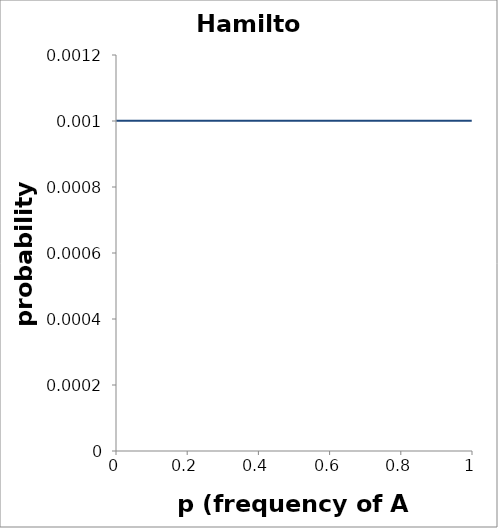
| Category | probability |
|---|---|
| 0.001 | 0.001 |
| 0.002 | 0.001 |
| 0.003 | 0.001 |
| 0.004 | 0.001 |
| 0.005 | 0.001 |
| 0.006 | 0.001 |
| 0.007 | 0.001 |
| 0.008 | 0.001 |
| 0.009 | 0.001 |
| 0.01 | 0.001 |
| 0.011 | 0.001 |
| 0.012 | 0.001 |
| 0.013 | 0.001 |
| 0.014 | 0.001 |
| 0.015 | 0.001 |
| 0.016 | 0.001 |
| 0.017 | 0.001 |
| 0.018 | 0.001 |
| 0.019 | 0.001 |
| 0.02 | 0.001 |
| 0.021 | 0.001 |
| 0.022 | 0.001 |
| 0.023 | 0.001 |
| 0.024 | 0.001 |
| 0.025 | 0.001 |
| 0.026 | 0.001 |
| 0.027 | 0.001 |
| 0.028 | 0.001 |
| 0.029 | 0.001 |
| 0.03 | 0.001 |
| 0.031 | 0.001 |
| 0.032 | 0.001 |
| 0.033 | 0.001 |
| 0.034 | 0.001 |
| 0.035 | 0.001 |
| 0.036 | 0.001 |
| 0.037 | 0.001 |
| 0.038 | 0.001 |
| 0.039 | 0.001 |
| 0.04 | 0.001 |
| 0.041 | 0.001 |
| 0.042 | 0.001 |
| 0.043 | 0.001 |
| 0.044 | 0.001 |
| 0.045 | 0.001 |
| 0.046 | 0.001 |
| 0.047 | 0.001 |
| 0.048 | 0.001 |
| 0.049 | 0.001 |
| 0.05 | 0.001 |
| 0.051 | 0.001 |
| 0.052 | 0.001 |
| 0.053 | 0.001 |
| 0.054 | 0.001 |
| 0.055 | 0.001 |
| 0.056 | 0.001 |
| 0.057 | 0.001 |
| 0.058 | 0.001 |
| 0.059 | 0.001 |
| 0.06 | 0.001 |
| 0.061 | 0.001 |
| 0.062 | 0.001 |
| 0.063 | 0.001 |
| 0.064 | 0.001 |
| 0.065 | 0.001 |
| 0.066 | 0.001 |
| 0.067 | 0.001 |
| 0.068 | 0.001 |
| 0.069 | 0.001 |
| 0.07 | 0.001 |
| 0.071 | 0.001 |
| 0.072 | 0.001 |
| 0.073 | 0.001 |
| 0.074 | 0.001 |
| 0.075 | 0.001 |
| 0.076 | 0.001 |
| 0.077 | 0.001 |
| 0.078 | 0.001 |
| 0.079 | 0.001 |
| 0.08 | 0.001 |
| 0.081 | 0.001 |
| 0.082 | 0.001 |
| 0.083 | 0.001 |
| 0.084 | 0.001 |
| 0.085 | 0.001 |
| 0.086 | 0.001 |
| 0.087 | 0.001 |
| 0.088 | 0.001 |
| 0.089 | 0.001 |
| 0.09 | 0.001 |
| 0.091 | 0.001 |
| 0.092 | 0.001 |
| 0.093 | 0.001 |
| 0.094 | 0.001 |
| 0.095 | 0.001 |
| 0.096 | 0.001 |
| 0.097 | 0.001 |
| 0.098 | 0.001 |
| 0.099 | 0.001 |
| 0.1 | 0.001 |
| 0.101 | 0.001 |
| 0.102 | 0.001 |
| 0.103 | 0.001 |
| 0.104 | 0.001 |
| 0.105 | 0.001 |
| 0.106 | 0.001 |
| 0.107 | 0.001 |
| 0.108 | 0.001 |
| 0.109 | 0.001 |
| 0.11 | 0.001 |
| 0.111 | 0.001 |
| 0.112 | 0.001 |
| 0.113 | 0.001 |
| 0.114 | 0.001 |
| 0.115 | 0.001 |
| 0.116 | 0.001 |
| 0.117 | 0.001 |
| 0.118 | 0.001 |
| 0.119 | 0.001 |
| 0.12 | 0.001 |
| 0.121 | 0.001 |
| 0.122 | 0.001 |
| 0.123 | 0.001 |
| 0.124 | 0.001 |
| 0.125 | 0.001 |
| 0.126 | 0.001 |
| 0.127 | 0.001 |
| 0.128 | 0.001 |
| 0.129 | 0.001 |
| 0.13 | 0.001 |
| 0.131 | 0.001 |
| 0.132 | 0.001 |
| 0.133 | 0.001 |
| 0.134 | 0.001 |
| 0.135 | 0.001 |
| 0.136 | 0.001 |
| 0.137 | 0.001 |
| 0.138 | 0.001 |
| 0.139 | 0.001 |
| 0.14 | 0.001 |
| 0.141 | 0.001 |
| 0.142 | 0.001 |
| 0.143 | 0.001 |
| 0.144 | 0.001 |
| 0.145 | 0.001 |
| 0.146 | 0.001 |
| 0.147 | 0.001 |
| 0.148 | 0.001 |
| 0.149 | 0.001 |
| 0.15 | 0.001 |
| 0.151 | 0.001 |
| 0.152 | 0.001 |
| 0.153 | 0.001 |
| 0.154 | 0.001 |
| 0.155 | 0.001 |
| 0.156 | 0.001 |
| 0.157 | 0.001 |
| 0.158 | 0.001 |
| 0.159 | 0.001 |
| 0.16 | 0.001 |
| 0.161 | 0.001 |
| 0.162 | 0.001 |
| 0.163 | 0.001 |
| 0.164 | 0.001 |
| 0.165 | 0.001 |
| 0.166 | 0.001 |
| 0.167 | 0.001 |
| 0.168 | 0.001 |
| 0.169 | 0.001 |
| 0.17 | 0.001 |
| 0.171 | 0.001 |
| 0.172 | 0.001 |
| 0.173 | 0.001 |
| 0.174 | 0.001 |
| 0.175 | 0.001 |
| 0.176 | 0.001 |
| 0.177 | 0.001 |
| 0.178 | 0.001 |
| 0.179 | 0.001 |
| 0.18 | 0.001 |
| 0.181 | 0.001 |
| 0.182 | 0.001 |
| 0.183 | 0.001 |
| 0.184 | 0.001 |
| 0.185 | 0.001 |
| 0.186 | 0.001 |
| 0.187 | 0.001 |
| 0.188 | 0.001 |
| 0.189 | 0.001 |
| 0.19 | 0.001 |
| 0.191 | 0.001 |
| 0.192 | 0.001 |
| 0.193 | 0.001 |
| 0.194 | 0.001 |
| 0.195 | 0.001 |
| 0.196 | 0.001 |
| 0.197 | 0.001 |
| 0.198 | 0.001 |
| 0.199 | 0.001 |
| 0.2 | 0.001 |
| 0.201 | 0.001 |
| 0.202 | 0.001 |
| 0.203 | 0.001 |
| 0.204 | 0.001 |
| 0.205 | 0.001 |
| 0.206 | 0.001 |
| 0.207 | 0.001 |
| 0.208 | 0.001 |
| 0.209 | 0.001 |
| 0.21 | 0.001 |
| 0.211 | 0.001 |
| 0.212 | 0.001 |
| 0.213 | 0.001 |
| 0.214 | 0.001 |
| 0.215 | 0.001 |
| 0.216 | 0.001 |
| 0.217 | 0.001 |
| 0.218 | 0.001 |
| 0.219 | 0.001 |
| 0.22 | 0.001 |
| 0.221 | 0.001 |
| 0.222 | 0.001 |
| 0.223 | 0.001 |
| 0.224 | 0.001 |
| 0.225 | 0.001 |
| 0.226 | 0.001 |
| 0.227 | 0.001 |
| 0.228 | 0.001 |
| 0.229 | 0.001 |
| 0.23 | 0.001 |
| 0.231 | 0.001 |
| 0.232 | 0.001 |
| 0.233 | 0.001 |
| 0.234 | 0.001 |
| 0.235 | 0.001 |
| 0.236 | 0.001 |
| 0.237 | 0.001 |
| 0.238 | 0.001 |
| 0.239 | 0.001 |
| 0.24 | 0.001 |
| 0.241 | 0.001 |
| 0.242 | 0.001 |
| 0.243 | 0.001 |
| 0.244 | 0.001 |
| 0.245 | 0.001 |
| 0.246 | 0.001 |
| 0.247 | 0.001 |
| 0.248 | 0.001 |
| 0.249 | 0.001 |
| 0.25 | 0.001 |
| 0.251 | 0.001 |
| 0.252 | 0.001 |
| 0.253 | 0.001 |
| 0.254 | 0.001 |
| 0.255 | 0.001 |
| 0.256 | 0.001 |
| 0.257 | 0.001 |
| 0.258 | 0.001 |
| 0.259 | 0.001 |
| 0.26 | 0.001 |
| 0.261 | 0.001 |
| 0.262 | 0.001 |
| 0.263 | 0.001 |
| 0.264 | 0.001 |
| 0.265 | 0.001 |
| 0.266 | 0.001 |
| 0.267 | 0.001 |
| 0.268 | 0.001 |
| 0.269 | 0.001 |
| 0.27 | 0.001 |
| 0.271 | 0.001 |
| 0.272 | 0.001 |
| 0.273 | 0.001 |
| 0.274 | 0.001 |
| 0.275 | 0.001 |
| 0.276 | 0.001 |
| 0.277 | 0.001 |
| 0.278 | 0.001 |
| 0.279 | 0.001 |
| 0.28 | 0.001 |
| 0.281 | 0.001 |
| 0.282 | 0.001 |
| 0.283 | 0.001 |
| 0.284 | 0.001 |
| 0.285 | 0.001 |
| 0.286 | 0.001 |
| 0.287 | 0.001 |
| 0.288 | 0.001 |
| 0.289 | 0.001 |
| 0.29 | 0.001 |
| 0.291 | 0.001 |
| 0.292 | 0.001 |
| 0.293 | 0.001 |
| 0.294 | 0.001 |
| 0.295 | 0.001 |
| 0.296 | 0.001 |
| 0.297 | 0.001 |
| 0.298 | 0.001 |
| 0.299 | 0.001 |
| 0.3 | 0.001 |
| 0.301 | 0.001 |
| 0.302 | 0.001 |
| 0.303 | 0.001 |
| 0.304 | 0.001 |
| 0.305 | 0.001 |
| 0.306 | 0.001 |
| 0.307 | 0.001 |
| 0.308 | 0.001 |
| 0.309 | 0.001 |
| 0.31 | 0.001 |
| 0.311 | 0.001 |
| 0.312 | 0.001 |
| 0.313 | 0.001 |
| 0.314 | 0.001 |
| 0.315 | 0.001 |
| 0.316 | 0.001 |
| 0.317 | 0.001 |
| 0.318 | 0.001 |
| 0.319 | 0.001 |
| 0.32 | 0.001 |
| 0.321 | 0.001 |
| 0.322 | 0.001 |
| 0.323 | 0.001 |
| 0.324 | 0.001 |
| 0.325 | 0.001 |
| 0.326 | 0.001 |
| 0.327 | 0.001 |
| 0.328 | 0.001 |
| 0.329 | 0.001 |
| 0.33 | 0.001 |
| 0.331 | 0.001 |
| 0.332 | 0.001 |
| 0.333 | 0.001 |
| 0.334 | 0.001 |
| 0.335 | 0.001 |
| 0.336 | 0.001 |
| 0.337 | 0.001 |
| 0.338 | 0.001 |
| 0.339 | 0.001 |
| 0.34 | 0.001 |
| 0.341 | 0.001 |
| 0.342 | 0.001 |
| 0.343 | 0.001 |
| 0.344 | 0.001 |
| 0.345 | 0.001 |
| 0.346 | 0.001 |
| 0.347 | 0.001 |
| 0.348 | 0.001 |
| 0.349 | 0.001 |
| 0.35 | 0.001 |
| 0.351 | 0.001 |
| 0.352 | 0.001 |
| 0.353 | 0.001 |
| 0.354 | 0.001 |
| 0.355 | 0.001 |
| 0.356 | 0.001 |
| 0.357 | 0.001 |
| 0.358 | 0.001 |
| 0.359 | 0.001 |
| 0.36 | 0.001 |
| 0.361 | 0.001 |
| 0.362 | 0.001 |
| 0.363 | 0.001 |
| 0.364 | 0.001 |
| 0.365 | 0.001 |
| 0.366 | 0.001 |
| 0.367 | 0.001 |
| 0.368 | 0.001 |
| 0.369 | 0.001 |
| 0.37 | 0.001 |
| 0.371 | 0.001 |
| 0.372 | 0.001 |
| 0.373 | 0.001 |
| 0.374 | 0.001 |
| 0.375 | 0.001 |
| 0.376 | 0.001 |
| 0.377 | 0.001 |
| 0.378 | 0.001 |
| 0.379 | 0.001 |
| 0.38 | 0.001 |
| 0.381 | 0.001 |
| 0.382 | 0.001 |
| 0.383 | 0.001 |
| 0.384 | 0.001 |
| 0.385 | 0.001 |
| 0.386 | 0.001 |
| 0.387 | 0.001 |
| 0.388 | 0.001 |
| 0.389 | 0.001 |
| 0.39 | 0.001 |
| 0.391 | 0.001 |
| 0.392 | 0.001 |
| 0.393 | 0.001 |
| 0.394 | 0.001 |
| 0.395 | 0.001 |
| 0.396 | 0.001 |
| 0.397 | 0.001 |
| 0.398 | 0.001 |
| 0.399 | 0.001 |
| 0.4 | 0.001 |
| 0.401 | 0.001 |
| 0.402 | 0.001 |
| 0.403 | 0.001 |
| 0.404 | 0.001 |
| 0.405 | 0.001 |
| 0.406 | 0.001 |
| 0.407 | 0.001 |
| 0.408 | 0.001 |
| 0.409 | 0.001 |
| 0.41 | 0.001 |
| 0.411 | 0.001 |
| 0.412 | 0.001 |
| 0.413 | 0.001 |
| 0.414 | 0.001 |
| 0.415 | 0.001 |
| 0.416 | 0.001 |
| 0.417 | 0.001 |
| 0.418 | 0.001 |
| 0.419 | 0.001 |
| 0.42 | 0.001 |
| 0.421 | 0.001 |
| 0.422 | 0.001 |
| 0.423 | 0.001 |
| 0.424 | 0.001 |
| 0.425 | 0.001 |
| 0.426 | 0.001 |
| 0.427 | 0.001 |
| 0.428 | 0.001 |
| 0.429 | 0.001 |
| 0.43 | 0.001 |
| 0.431 | 0.001 |
| 0.432 | 0.001 |
| 0.433 | 0.001 |
| 0.434 | 0.001 |
| 0.435 | 0.001 |
| 0.436 | 0.001 |
| 0.437 | 0.001 |
| 0.438 | 0.001 |
| 0.439 | 0.001 |
| 0.44 | 0.001 |
| 0.441 | 0.001 |
| 0.442 | 0.001 |
| 0.443 | 0.001 |
| 0.444 | 0.001 |
| 0.445 | 0.001 |
| 0.446 | 0.001 |
| 0.447 | 0.001 |
| 0.448 | 0.001 |
| 0.449 | 0.001 |
| 0.45 | 0.001 |
| 0.451 | 0.001 |
| 0.452 | 0.001 |
| 0.453 | 0.001 |
| 0.454 | 0.001 |
| 0.455 | 0.001 |
| 0.456 | 0.001 |
| 0.457 | 0.001 |
| 0.458 | 0.001 |
| 0.459 | 0.001 |
| 0.46 | 0.001 |
| 0.461 | 0.001 |
| 0.462 | 0.001 |
| 0.463 | 0.001 |
| 0.464 | 0.001 |
| 0.465 | 0.001 |
| 0.466 | 0.001 |
| 0.467 | 0.001 |
| 0.468 | 0.001 |
| 0.469 | 0.001 |
| 0.47 | 0.001 |
| 0.471 | 0.001 |
| 0.472 | 0.001 |
| 0.473 | 0.001 |
| 0.474 | 0.001 |
| 0.475 | 0.001 |
| 0.476 | 0.001 |
| 0.477 | 0.001 |
| 0.478 | 0.001 |
| 0.479 | 0.001 |
| 0.48 | 0.001 |
| 0.481 | 0.001 |
| 0.482 | 0.001 |
| 0.483 | 0.001 |
| 0.484 | 0.001 |
| 0.485 | 0.001 |
| 0.486 | 0.001 |
| 0.487 | 0.001 |
| 0.488 | 0.001 |
| 0.489 | 0.001 |
| 0.49 | 0.001 |
| 0.491 | 0.001 |
| 0.492 | 0.001 |
| 0.493 | 0.001 |
| 0.494 | 0.001 |
| 0.495 | 0.001 |
| 0.496 | 0.001 |
| 0.497 | 0.001 |
| 0.498 | 0.001 |
| 0.499 | 0.001 |
| 0.5 | 0.001 |
| 0.501 | 0.001 |
| 0.502 | 0.001 |
| 0.503 | 0.001 |
| 0.504 | 0.001 |
| 0.505 | 0.001 |
| 0.506 | 0.001 |
| 0.507 | 0.001 |
| 0.508 | 0.001 |
| 0.509 | 0.001 |
| 0.51 | 0.001 |
| 0.511 | 0.001 |
| 0.512 | 0.001 |
| 0.513 | 0.001 |
| 0.514 | 0.001 |
| 0.515 | 0.001 |
| 0.516 | 0.001 |
| 0.517 | 0.001 |
| 0.518 | 0.001 |
| 0.519 | 0.001 |
| 0.52 | 0.001 |
| 0.521 | 0.001 |
| 0.522 | 0.001 |
| 0.523 | 0.001 |
| 0.524 | 0.001 |
| 0.525 | 0.001 |
| 0.526 | 0.001 |
| 0.527 | 0.001 |
| 0.528 | 0.001 |
| 0.529 | 0.001 |
| 0.53 | 0.001 |
| 0.531 | 0.001 |
| 0.532 | 0.001 |
| 0.533 | 0.001 |
| 0.534 | 0.001 |
| 0.535 | 0.001 |
| 0.536 | 0.001 |
| 0.537 | 0.001 |
| 0.538 | 0.001 |
| 0.539 | 0.001 |
| 0.54 | 0.001 |
| 0.541 | 0.001 |
| 0.542 | 0.001 |
| 0.543 | 0.001 |
| 0.544 | 0.001 |
| 0.545 | 0.001 |
| 0.546 | 0.001 |
| 0.547 | 0.001 |
| 0.548 | 0.001 |
| 0.549 | 0.001 |
| 0.55 | 0.001 |
| 0.551 | 0.001 |
| 0.552 | 0.001 |
| 0.553 | 0.001 |
| 0.554 | 0.001 |
| 0.555 | 0.001 |
| 0.556 | 0.001 |
| 0.557 | 0.001 |
| 0.558 | 0.001 |
| 0.559 | 0.001 |
| 0.56 | 0.001 |
| 0.561 | 0.001 |
| 0.562 | 0.001 |
| 0.563 | 0.001 |
| 0.564 | 0.001 |
| 0.565 | 0.001 |
| 0.566 | 0.001 |
| 0.567 | 0.001 |
| 0.568 | 0.001 |
| 0.569 | 0.001 |
| 0.57 | 0.001 |
| 0.571 | 0.001 |
| 0.572 | 0.001 |
| 0.573 | 0.001 |
| 0.574 | 0.001 |
| 0.575 | 0.001 |
| 0.576 | 0.001 |
| 0.577 | 0.001 |
| 0.578 | 0.001 |
| 0.579 | 0.001 |
| 0.58 | 0.001 |
| 0.581 | 0.001 |
| 0.582 | 0.001 |
| 0.583 | 0.001 |
| 0.584 | 0.001 |
| 0.585 | 0.001 |
| 0.586 | 0.001 |
| 0.587 | 0.001 |
| 0.588 | 0.001 |
| 0.589 | 0.001 |
| 0.59 | 0.001 |
| 0.591 | 0.001 |
| 0.592 | 0.001 |
| 0.593 | 0.001 |
| 0.594 | 0.001 |
| 0.595 | 0.001 |
| 0.596 | 0.001 |
| 0.597 | 0.001 |
| 0.598 | 0.001 |
| 0.599 | 0.001 |
| 0.6 | 0.001 |
| 0.601 | 0.001 |
| 0.602 | 0.001 |
| 0.603 | 0.001 |
| 0.604 | 0.001 |
| 0.605 | 0.001 |
| 0.606 | 0.001 |
| 0.607 | 0.001 |
| 0.608 | 0.001 |
| 0.609 | 0.001 |
| 0.61 | 0.001 |
| 0.611 | 0.001 |
| 0.612 | 0.001 |
| 0.613 | 0.001 |
| 0.614 | 0.001 |
| 0.615 | 0.001 |
| 0.616 | 0.001 |
| 0.617 | 0.001 |
| 0.618 | 0.001 |
| 0.619 | 0.001 |
| 0.62 | 0.001 |
| 0.621 | 0.001 |
| 0.622 | 0.001 |
| 0.623 | 0.001 |
| 0.624 | 0.001 |
| 0.625 | 0.001 |
| 0.626 | 0.001 |
| 0.627 | 0.001 |
| 0.628 | 0.001 |
| 0.629 | 0.001 |
| 0.63 | 0.001 |
| 0.631 | 0.001 |
| 0.632 | 0.001 |
| 0.633 | 0.001 |
| 0.634 | 0.001 |
| 0.635 | 0.001 |
| 0.636 | 0.001 |
| 0.637 | 0.001 |
| 0.638 | 0.001 |
| 0.639 | 0.001 |
| 0.64 | 0.001 |
| 0.641 | 0.001 |
| 0.642 | 0.001 |
| 0.643 | 0.001 |
| 0.644 | 0.001 |
| 0.645 | 0.001 |
| 0.646 | 0.001 |
| 0.647 | 0.001 |
| 0.648 | 0.001 |
| 0.649 | 0.001 |
| 0.65 | 0.001 |
| 0.651 | 0.001 |
| 0.652 | 0.001 |
| 0.653 | 0.001 |
| 0.654 | 0.001 |
| 0.655 | 0.001 |
| 0.656 | 0.001 |
| 0.657 | 0.001 |
| 0.658 | 0.001 |
| 0.659 | 0.001 |
| 0.66 | 0.001 |
| 0.661 | 0.001 |
| 0.662 | 0.001 |
| 0.663 | 0.001 |
| 0.664 | 0.001 |
| 0.665 | 0.001 |
| 0.666 | 0.001 |
| 0.667 | 0.001 |
| 0.668 | 0.001 |
| 0.669 | 0.001 |
| 0.67 | 0.001 |
| 0.671 | 0.001 |
| 0.672 | 0.001 |
| 0.673 | 0.001 |
| 0.674 | 0.001 |
| 0.675 | 0.001 |
| 0.676 | 0.001 |
| 0.677 | 0.001 |
| 0.678 | 0.001 |
| 0.679 | 0.001 |
| 0.68 | 0.001 |
| 0.681 | 0.001 |
| 0.682 | 0.001 |
| 0.683 | 0.001 |
| 0.684 | 0.001 |
| 0.685 | 0.001 |
| 0.686 | 0.001 |
| 0.687 | 0.001 |
| 0.688 | 0.001 |
| 0.689 | 0.001 |
| 0.69 | 0.001 |
| 0.691 | 0.001 |
| 0.692 | 0.001 |
| 0.693 | 0.001 |
| 0.694 | 0.001 |
| 0.695 | 0.001 |
| 0.696 | 0.001 |
| 0.697 | 0.001 |
| 0.698 | 0.001 |
| 0.699 | 0.001 |
| 0.7 | 0.001 |
| 0.701 | 0.001 |
| 0.702 | 0.001 |
| 0.703 | 0.001 |
| 0.704 | 0.001 |
| 0.705 | 0.001 |
| 0.706 | 0.001 |
| 0.707 | 0.001 |
| 0.708 | 0.001 |
| 0.709 | 0.001 |
| 0.71 | 0.001 |
| 0.711 | 0.001 |
| 0.712 | 0.001 |
| 0.713 | 0.001 |
| 0.714 | 0.001 |
| 0.715 | 0.001 |
| 0.716 | 0.001 |
| 0.717 | 0.001 |
| 0.718 | 0.001 |
| 0.719 | 0.001 |
| 0.72 | 0.001 |
| 0.721 | 0.001 |
| 0.722 | 0.001 |
| 0.723 | 0.001 |
| 0.724 | 0.001 |
| 0.725 | 0.001 |
| 0.726 | 0.001 |
| 0.727 | 0.001 |
| 0.728 | 0.001 |
| 0.729 | 0.001 |
| 0.73 | 0.001 |
| 0.731 | 0.001 |
| 0.732 | 0.001 |
| 0.733 | 0.001 |
| 0.734 | 0.001 |
| 0.735 | 0.001 |
| 0.736 | 0.001 |
| 0.737 | 0.001 |
| 0.738 | 0.001 |
| 0.739 | 0.001 |
| 0.74 | 0.001 |
| 0.741 | 0.001 |
| 0.742 | 0.001 |
| 0.743 | 0.001 |
| 0.744 | 0.001 |
| 0.745 | 0.001 |
| 0.746 | 0.001 |
| 0.747 | 0.001 |
| 0.748 | 0.001 |
| 0.749 | 0.001 |
| 0.75 | 0.001 |
| 0.751 | 0.001 |
| 0.752 | 0.001 |
| 0.753 | 0.001 |
| 0.754 | 0.001 |
| 0.755 | 0.001 |
| 0.756 | 0.001 |
| 0.757 | 0.001 |
| 0.758 | 0.001 |
| 0.759 | 0.001 |
| 0.76 | 0.001 |
| 0.761 | 0.001 |
| 0.762 | 0.001 |
| 0.763 | 0.001 |
| 0.764 | 0.001 |
| 0.765 | 0.001 |
| 0.766 | 0.001 |
| 0.767 | 0.001 |
| 0.768 | 0.001 |
| 0.769 | 0.001 |
| 0.77 | 0.001 |
| 0.771 | 0.001 |
| 0.772 | 0.001 |
| 0.773 | 0.001 |
| 0.774 | 0.001 |
| 0.775 | 0.001 |
| 0.776 | 0.001 |
| 0.777 | 0.001 |
| 0.778 | 0.001 |
| 0.779 | 0.001 |
| 0.78 | 0.001 |
| 0.781 | 0.001 |
| 0.782 | 0.001 |
| 0.783 | 0.001 |
| 0.784 | 0.001 |
| 0.785 | 0.001 |
| 0.786 | 0.001 |
| 0.787 | 0.001 |
| 0.788 | 0.001 |
| 0.789 | 0.001 |
| 0.79 | 0.001 |
| 0.791 | 0.001 |
| 0.792 | 0.001 |
| 0.793 | 0.001 |
| 0.794 | 0.001 |
| 0.795 | 0.001 |
| 0.796 | 0.001 |
| 0.797 | 0.001 |
| 0.798 | 0.001 |
| 0.799 | 0.001 |
| 0.8 | 0.001 |
| 0.801 | 0.001 |
| 0.802 | 0.001 |
| 0.803 | 0.001 |
| 0.804 | 0.001 |
| 0.805 | 0.001 |
| 0.806 | 0.001 |
| 0.807 | 0.001 |
| 0.808 | 0.001 |
| 0.809 | 0.001 |
| 0.81 | 0.001 |
| 0.811 | 0.001 |
| 0.812 | 0.001 |
| 0.813 | 0.001 |
| 0.814 | 0.001 |
| 0.815 | 0.001 |
| 0.816 | 0.001 |
| 0.817 | 0.001 |
| 0.818 | 0.001 |
| 0.819 | 0.001 |
| 0.82 | 0.001 |
| 0.821 | 0.001 |
| 0.822 | 0.001 |
| 0.823 | 0.001 |
| 0.824 | 0.001 |
| 0.825 | 0.001 |
| 0.826 | 0.001 |
| 0.827 | 0.001 |
| 0.828 | 0.001 |
| 0.829 | 0.001 |
| 0.83 | 0.001 |
| 0.831 | 0.001 |
| 0.832 | 0.001 |
| 0.833 | 0.001 |
| 0.834 | 0.001 |
| 0.835 | 0.001 |
| 0.836 | 0.001 |
| 0.837 | 0.001 |
| 0.838 | 0.001 |
| 0.839 | 0.001 |
| 0.84 | 0.001 |
| 0.841 | 0.001 |
| 0.842 | 0.001 |
| 0.843 | 0.001 |
| 0.844 | 0.001 |
| 0.845 | 0.001 |
| 0.846 | 0.001 |
| 0.847 | 0.001 |
| 0.848 | 0.001 |
| 0.849 | 0.001 |
| 0.85 | 0.001 |
| 0.851 | 0.001 |
| 0.852 | 0.001 |
| 0.853 | 0.001 |
| 0.854 | 0.001 |
| 0.855 | 0.001 |
| 0.856 | 0.001 |
| 0.857 | 0.001 |
| 0.858 | 0.001 |
| 0.859 | 0.001 |
| 0.86 | 0.001 |
| 0.861 | 0.001 |
| 0.862 | 0.001 |
| 0.863 | 0.001 |
| 0.864 | 0.001 |
| 0.865 | 0.001 |
| 0.866 | 0.001 |
| 0.867 | 0.001 |
| 0.868 | 0.001 |
| 0.869 | 0.001 |
| 0.87 | 0.001 |
| 0.871 | 0.001 |
| 0.872 | 0.001 |
| 0.873 | 0.001 |
| 0.874 | 0.001 |
| 0.875 | 0.001 |
| 0.876 | 0.001 |
| 0.877 | 0.001 |
| 0.878 | 0.001 |
| 0.879 | 0.001 |
| 0.88 | 0.001 |
| 0.881 | 0.001 |
| 0.882 | 0.001 |
| 0.883 | 0.001 |
| 0.884 | 0.001 |
| 0.885 | 0.001 |
| 0.886 | 0.001 |
| 0.887 | 0.001 |
| 0.888 | 0.001 |
| 0.889 | 0.001 |
| 0.89 | 0.001 |
| 0.891 | 0.001 |
| 0.892 | 0.001 |
| 0.893 | 0.001 |
| 0.894 | 0.001 |
| 0.895 | 0.001 |
| 0.896 | 0.001 |
| 0.897 | 0.001 |
| 0.898 | 0.001 |
| 0.899 | 0.001 |
| 0.9 | 0.001 |
| 0.901 | 0.001 |
| 0.902 | 0.001 |
| 0.903 | 0.001 |
| 0.904 | 0.001 |
| 0.905 | 0.001 |
| 0.906 | 0.001 |
| 0.907 | 0.001 |
| 0.908 | 0.001 |
| 0.909 | 0.001 |
| 0.91 | 0.001 |
| 0.911 | 0.001 |
| 0.912 | 0.001 |
| 0.913 | 0.001 |
| 0.914 | 0.001 |
| 0.915 | 0.001 |
| 0.916 | 0.001 |
| 0.917 | 0.001 |
| 0.918 | 0.001 |
| 0.919 | 0.001 |
| 0.92 | 0.001 |
| 0.921 | 0.001 |
| 0.922 | 0.001 |
| 0.923 | 0.001 |
| 0.924 | 0.001 |
| 0.925 | 0.001 |
| 0.926 | 0.001 |
| 0.927 | 0.001 |
| 0.928 | 0.001 |
| 0.929 | 0.001 |
| 0.93 | 0.001 |
| 0.931 | 0.001 |
| 0.932 | 0.001 |
| 0.933 | 0.001 |
| 0.934 | 0.001 |
| 0.935 | 0.001 |
| 0.936 | 0.001 |
| 0.937 | 0.001 |
| 0.938 | 0.001 |
| 0.939 | 0.001 |
| 0.94 | 0.001 |
| 0.941 | 0.001 |
| 0.942 | 0.001 |
| 0.943 | 0.001 |
| 0.944 | 0.001 |
| 0.945 | 0.001 |
| 0.946 | 0.001 |
| 0.947 | 0.001 |
| 0.948 | 0.001 |
| 0.949 | 0.001 |
| 0.95 | 0.001 |
| 0.951 | 0.001 |
| 0.952 | 0.001 |
| 0.953 | 0.001 |
| 0.954 | 0.001 |
| 0.955 | 0.001 |
| 0.956 | 0.001 |
| 0.957 | 0.001 |
| 0.958 | 0.001 |
| 0.959 | 0.001 |
| 0.96 | 0.001 |
| 0.961 | 0.001 |
| 0.962 | 0.001 |
| 0.963 | 0.001 |
| 0.964 | 0.001 |
| 0.965 | 0.001 |
| 0.966 | 0.001 |
| 0.967 | 0.001 |
| 0.968 | 0.001 |
| 0.969 | 0.001 |
| 0.97 | 0.001 |
| 0.971 | 0.001 |
| 0.972 | 0.001 |
| 0.973 | 0.001 |
| 0.974 | 0.001 |
| 0.975 | 0.001 |
| 0.976 | 0.001 |
| 0.977 | 0.001 |
| 0.978 | 0.001 |
| 0.979 | 0.001 |
| 0.98 | 0.001 |
| 0.981 | 0.001 |
| 0.982 | 0.001 |
| 0.983 | 0.001 |
| 0.984 | 0.001 |
| 0.985 | 0.001 |
| 0.986 | 0.001 |
| 0.987 | 0.001 |
| 0.988 | 0.001 |
| 0.989 | 0.001 |
| 0.99 | 0.001 |
| 0.991 | 0.001 |
| 0.992 | 0.001 |
| 0.993 | 0.001 |
| 0.994 | 0.001 |
| 0.995 | 0.001 |
| 0.996 | 0.001 |
| 0.997 | 0.001 |
| 0.998 | 0.001 |
| 0.999 | 0.001 |